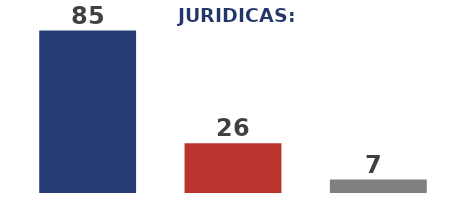
| Category | Series 0 |
|---|---|
| 0 | 85 |
| 1 | 26 |
| 2 | 7 |